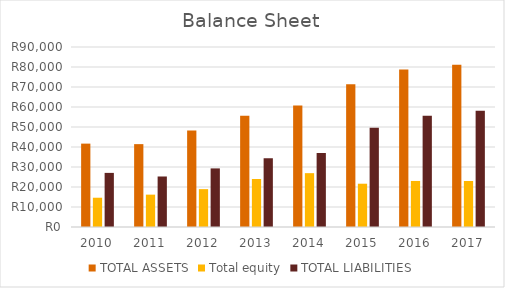
| Category | TOTAL ASSETS | Total equity | TOTAL LIABILITIES |
|---|---|---|---|
| 2010.0 | 41691 | 14636 | 27055 |
| 2011.0 | 41435 | 16180 | 25255 |
| 2012.0 | 48230 | 18930 | 29300 |
| 2013.0 | 55591 | 23994 | 34375 |
| 2014.0 | 60741 | 26921 | 36998 |
| 2015.0 | 71363 | 21643 | 49664 |
| 2016.0 | 78703 | 23024 | 55679 |
| 2017.0 | 81138 | 22996 | 58142 |